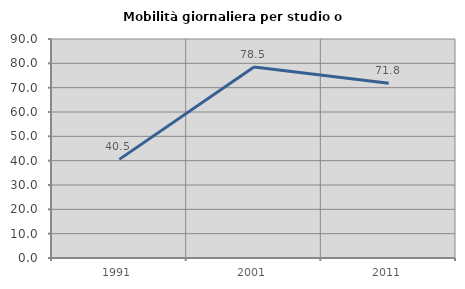
| Category | Mobilità giornaliera per studio o lavoro |
|---|---|
| 1991.0 | 40.533 |
| 2001.0 | 78.526 |
| 2011.0 | 71.835 |